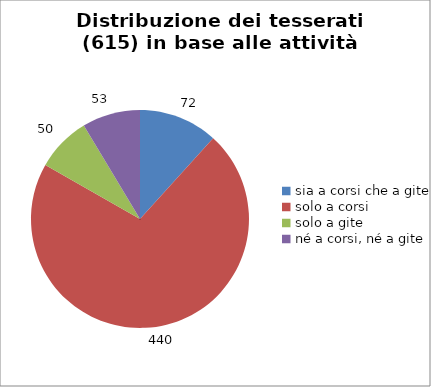
| Category | Nr. Tesserati |
|---|---|
| sia a corsi che a gite | 72 |
| solo a corsi | 440 |
| solo a gite | 50 |
| né a corsi, né a gite | 53 |